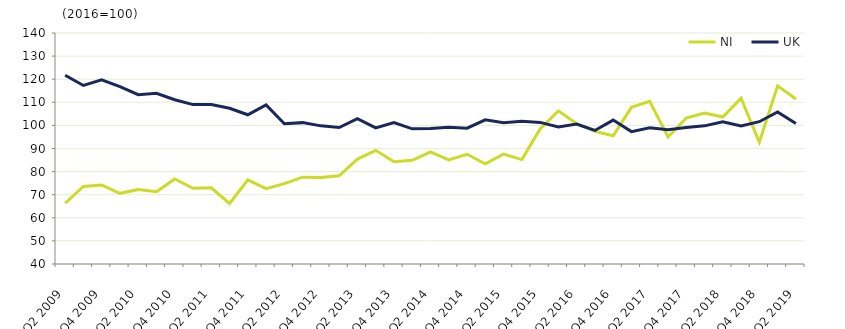
| Category | NI  | UK  |
|---|---|---|
| Q2 2009 | 66.3 | 121.7 |
|  | 73.6 | 117.3 |
| Q4 2009 | 74.2 | 119.7 |
|  | 70.6 | 116.8 |
| Q2 2010 | 72.2 | 113.3 |
|  | 71.3 | 113.9 |
| Q4 2010 | 76.8 | 111.1 |
|  | 72.8 | 109 |
| Q2 2011 | 73 | 109 |
|  | 66.2 | 107.4 |
| Q4 2011 | 76.4 | 104.6 |
|  | 72.6 | 108.9 |
| Q2 2012 | 74.8 | 100.7 |
|  | 77.6 | 101.2 |
| Q4 2012 | 77.5 | 99.8 |
|  | 78.2 | 99.1 |
| Q2 2013 | 85.4 | 102.9 |
|  | 89.2 | 98.9 |
| Q4 2013 | 84.3 | 101.2 |
|  | 84.9 | 98.5 |
| Q2 2014 | 88.5 | 98.7 |
|  | 85.1 | 99.2 |
| Q4 2014 | 87.5 | 98.8 |
|  | 83.4 | 102.4 |
| Q2 2015 | 87.6 | 101.2 |
|  | 85.2 | 101.8 |
| Q4 2015 | 98.5 | 101.3 |
|  | 106.3 | 99.3 |
| Q2 2016 | 100.7 | 100.6 |
|  | 97.4 | 97.8 |
| Q4 2016 | 95.5 | 102.3 |
|  | 107.8 | 97.3 |
| Q2 2017 | 110.4 | 99 |
|  | 95 | 98.1 |
| Q4 2017 | 103.2 | 99.1 |
|  | 105.3 | 99.8 |
| Q2 2018 | 103.6 | 101.6 |
|  | 111.8 | 99.8 |
| Q4 2018 | 92.7 | 101.6 |
|  | 117.1 | 105.8 |
| Q2 2019 | 111.4 | 100.8 |